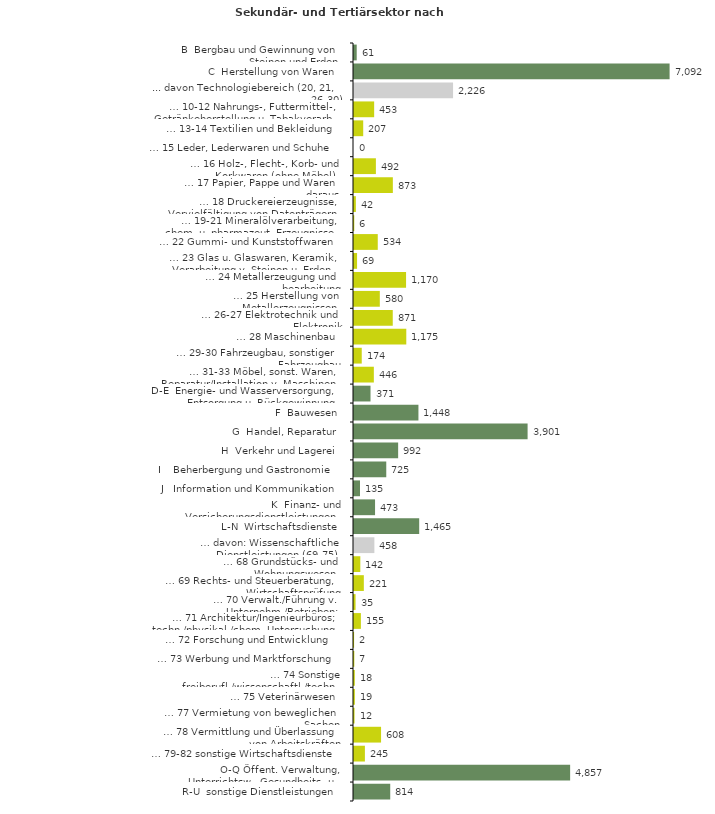
| Category | Series 0 |
|---|---|
| B  Bergbau und Gewinnung von Steinen und Erden | 61 |
| C  Herstellung von Waren | 7092 |
| ... davon Technologiebereich (20, 21, 26-30) | 2226 |
| … 10-12 Nahrungs-, Futtermittel-, Getränkeherstellung u. Tabakverarb. | 453 |
| … 13-14 Textilien und Bekleidung | 207 |
| … 15 Leder, Lederwaren und Schuhe | 0 |
| … 16 Holz-, Flecht-, Korb- und Korkwaren (ohne Möbel)  | 492 |
| … 17 Papier, Pappe und Waren daraus  | 873 |
| … 18 Druckereierzeugnisse, Vervielfältigung von Datenträgern | 42 |
| … 19-21 Mineralölverarbeitung, chem. u. pharmazeut. Erzeugnisse | 6 |
| … 22 Gummi- und Kunststoffwaren | 534 |
| … 23 Glas u. Glaswaren, Keramik, Verarbeitung v. Steinen u. Erden  | 69 |
| … 24 Metallerzeugung und -bearbeitung | 1170 |
| … 25 Herstellung von Metallerzeugnissen  | 580 |
| … 26-27 Elektrotechnik und Elektronik | 871 |
| … 28 Maschinenbau | 1175 |
| … 29-30 Fahrzeugbau, sonstiger Fahrzeugbau | 174 |
| … 31-33 Möbel, sonst. Waren, Reparatur/Installation v. Maschinen | 446 |
| D-E  Energie- und Wasserversorgung, Entsorgung u. Rückgewinnung | 371 |
| F  Bauwesen | 1448 |
| G  Handel, Reparatur | 3901 |
| H  Verkehr und Lagerei | 992 |
| I    Beherbergung und Gastronomie | 725 |
| J   Information und Kommunikation | 135 |
| K  Finanz- und Versicherungsdienstleistungen | 473 |
| L-N  Wirtschaftsdienste | 1465 |
| … davon: Wissenschaftliche Dienstleistungen (69-75) | 458 |
| … 68 Grundstücks- und Wohnungswesen  | 142 |
| … 69 Rechts- und Steuerberatung, Wirtschaftsprüfung | 221 |
| … 70 Verwalt./Führung v. Unternehm./Betrieben; Unternehmensberat. | 35 |
| … 71 Architektur/Ingenieurbüros; techn./physikal./chem. Untersuchung | 155 |
| … 72 Forschung und Entwicklung  | 2 |
| … 73 Werbung und Marktforschung | 7 |
| … 74 Sonstige freiberufl./wissenschaftl./techn. Tätigkeiten | 18 |
| … 75 Veterinärwesen | 19 |
| … 77 Vermietung von beweglichen Sachen  | 12 |
| … 78 Vermittlung und Überlassung von Arbeitskräften | 608 |
| … 79-82 sonstige Wirtschaftsdienste | 245 |
| O-Q Öffent. Verwaltung, Unterrichtsw., Gesundheits- u. Sozialwesen | 4857 |
| R-U  sonstige Dienstleistungen | 814 |